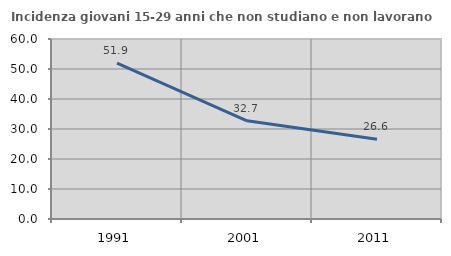
| Category | Incidenza giovani 15-29 anni che non studiano e non lavorano  |
|---|---|
| 1991.0 | 51.923 |
| 2001.0 | 32.737 |
| 2011.0 | 26.551 |